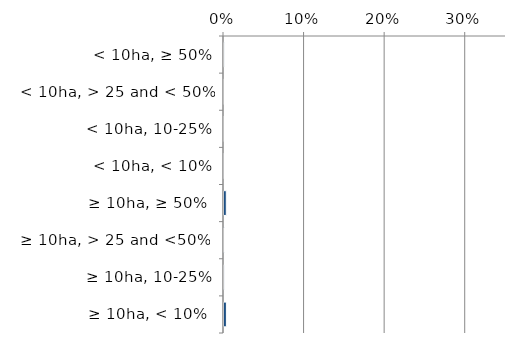
| Category | Near native & fragments |
|---|---|
|  ≥ 10ha, < 10%  | 0.004 |
|   ≥ 10ha, 10-25% | 0.001 |
|   ≥ 10ha, > 25 and <50%  | 0.002 |
|   ≥ 10ha, ≥ 50%  | 0.004 |
|  < 10ha, < 10% | 0.001 |
|  < 10ha, 10-25% | 0 |
|  < 10ha, > 25 and < 50% | 0 |
|  < 10ha, ≥ 50% | 0.002 |